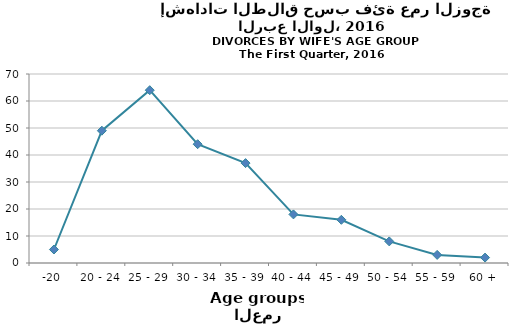
| Category | Series 0 |
|---|---|
| -20 | 5 |
| 20 - 24 | 49 |
| 25 - 29 | 64 |
| 30 - 34 | 44 |
| 35 - 39 | 37 |
| 40 - 44 | 18 |
| 45 - 49 | 16 |
| 50 - 54 | 8 |
| 55 - 59 | 3 |
| 60 + | 2 |